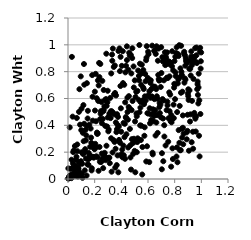
| Category | Series 0 |
|---|---|
| 0.8048160379679911 | 0.911 |
| 0.6412530690746505 | 0.43 |
| 0.036848699491668656 | 0.117 |
| 0.8508803725687043 | 0.799 |
| 0.6913978955041147 | 0.738 |
| 0.3902861109157759 | 0.27 |
| 0.5729293044220957 | 0.322 |
| 0.8110375856228726 | 0.939 |
| 0.24806886873163023 | 0.127 |
| 0.5027506385205199 | 0.429 |
| 0.44573678088368307 | 0.607 |
| 0.3434325248215889 | 0.835 |
| 0.561053336274124 | 0.586 |
| 0.24146370101987005 | 0.447 |
| 0.7851093031259042 | 0.449 |
| 0.20997103220456537 | 0.43 |
| 0.4303696479341876 | 0.795 |
| 0.10259249432398762 | 0.199 |
| 0.7798508613737885 | 0.84 |
| 0.24624403608130385 | 0.505 |
| 0.1730998822928173 | 0.308 |
| 0.8730987772841702 | 0.718 |
| 0.4771677226068377 | 0.513 |
| 0.19122029559249532 | 0.249 |
| 0.6785153978333146 | 0.972 |
| 0.03936746894879441 | 0.2 |
| 0.3206762801182168 | 0.505 |
| 0.38258311964538483 | 0.291 |
| 0.3844784113742594 | 0.281 |
| 0.3681660735472492 | 0.483 |
| 0.9689709140385898 | 0.669 |
| 0.6462743098852863 | 0.954 |
| 0.3099631757098164 | 0.159 |
| 0.8287489505397968 | 0.916 |
| 0.6857148374560557 | 0.536 |
| 0.4087598701721895 | 0.162 |
| 0.8693786946081973 | 0.936 |
| 0.8402111569531753 | 0.214 |
| 0.19983808856500268 | 0.223 |
| 0.806252504612378 | 0.794 |
| 0.29783745806520745 | 0.658 |
| 0.5157899796305667 | 0.467 |
| 0.8810528820988379 | 0.74 |
| 0.1490733598868999 | 0.508 |
| 0.4493409079521291 | 0.442 |
| 0.3490803277755809 | 0.276 |
| 0.8484357229467564 | 0.993 |
| 0.5293458375933919 | 0.591 |
| 0.4749559854918523 | 0.787 |
| 0.9367280181722548 | 0.352 |
| 0.6038354053874117 | 0.93 |
| 0.21098582234768798 | 0.238 |
| 0.12069687325942724 | 0.412 |
| 0.23005677510613035 | 0.698 |
| 0.020099144285102177 | 0.075 |
| 0.053496653326204194 | 0.084 |
| 0.14721049749832843 | 0.451 |
| 0.6044248210849298 | 0.487 |
| 0.9335570871204969 | 0.877 |
| 0.3604468680700396 | 0.623 |
| 0.643231094605576 | 0.489 |
| 0.9166533555953422 | 0.821 |
| 0.18891535484765548 | 0.24 |
| 0.37750553958991206 | 0.05 |
| 0.06481725295512407 | 0.038 |
| 0.49156706209330986 | 0.839 |
| 0.7650278276645177 | 0.87 |
| 0.7452519194500642 | 0.576 |
| 0.7916464292578508 | 0.554 |
| 0.4068009759231473 | 0.219 |
| 0.710834982930877 | 0.877 |
| 0.3133821718840352 | 0.118 |
| 0.7490497289972962 | 0.752 |
| 0.7035959168923077 | 0.072 |
| 0.3720860219728402 | 0.403 |
| 0.32833079129278914 | 0.505 |
| 0.6681677695936914 | 0.476 |
| 0.8272894318442069 | 0.741 |
| 0.04891064579619808 | 0.06 |
| 0.16629359704728555 | 0.24 |
| 0.023419354639812224 | 0.027 |
| 0.7985722187898523 | 0.879 |
| 0.16991982198271896 | 0.376 |
| 0.15444429967702467 | 0.195 |
| 0.18132061599412014 | 0.774 |
| 0.1702111666286856 | 0.163 |
| 0.9632057759010246 | 0.922 |
| 0.19315112764321993 | 0.159 |
| 0.31952743968310005 | 0.454 |
| 0.5693081703095949 | 0.571 |
| 0.004251761930587647 | 0.006 |
| 0.7430421501633343 | 0.943 |
| 0.697427239802067 | 0.46 |
| 0.9724679511926295 | 0.726 |
| 0.2173645918353844 | 0.346 |
| 0.9247368946319299 | 0.951 |
| 0.3632946576171775 | 0.349 |
| 0.5954264067940941 | 0.491 |
| 0.46419356395634676 | 0.373 |
| 0.6228622303132113 | 0.482 |
| 0.057300796040171006 | 0.049 |
| 0.4566102081277897 | 0.618 |
| 0.10893398358415206 | 0.009 |
| 0.6988001847450622 | 0.983 |
| 0.5646004305925687 | 0.812 |
| 0.33209803322518666 | 0.881 |
| 0.8081089625540443 | 0.767 |
| 0.596931256951981 | 0.619 |
| 0.3476574740772269 | 0.481 |
| 0.1397871017129596 | 0.026 |
| 0.45891351403084435 | 0.941 |
| 0.7169305897725119 | 0.585 |
| 0.9788435390067388 | 0.682 |
| 0.5787156323363809 | 0.783 |
| 0.7810713402161075 | 0.952 |
| 0.18611837737125309 | 0.435 |
| 0.05574871979741117 | 0.024 |
| 0.6547178969240556 | 0.513 |
| 0.17496583944255623 | 0.27 |
| 0.058492048325131656 | 0.097 |
| 0.2678159602451641 | 0.663 |
| 0.9384272792149398 | 0.225 |
| 0.1375155422211428 | 0.325 |
| 0.5160043820291768 | 0.2 |
| 0.695459926332687 | 0.686 |
| 0.8390021300136582 | 0.758 |
| 0.5818468911274911 | 0.729 |
| 0.9431416118818199 | 0.906 |
| 0.3654362141563176 | 0.104 |
| 0.35707544375562 | 0.226 |
| 0.7148270507419545 | 0.132 |
| 0.626209773768254 | 0.671 |
| 0.13431791821315836 | 0.153 |
| 0.9470443444692167 | 0.493 |
| 0.5500117425196831 | 0.397 |
| 0.9153122706672439 | 0.428 |
| 0.3588409693787901 | 0.421 |
| 0.5316174513720017 | 0.768 |
| 0.6642284447830702 | 0.989 |
| 0.7004161813679188 | 0.79 |
| 0.6769812162106348 | 0.776 |
| 0.3511859927170877 | 0.846 |
| 0.5750788586440214 | 0.385 |
| 0.8186558311569169 | 0.499 |
| 0.5678505033831696 | 0.671 |
| 0.2934922295686538 | 0.391 |
| 0.6314525070198469 | 0.994 |
| 0.28744572002241525 | 0.934 |
| 0.07585643305672715 | 0.08 |
| 0.32721904516621003 | 0.054 |
| 0.2792917243822691 | 0.395 |
| 0.1784138644780996 | 0.08 |
| 0.03143687584005224 | 0.034 |
| 0.576562385706362 | 0.616 |
| 0.37175541279924923 | 0.176 |
| 0.46128121574113173 | 0.526 |
| 0.8016925349532842 | 0.703 |
| 0.0025459312360142203 | 0.079 |
| 0.7255467778042767 | 0.874 |
| 0.8432535680032459 | 0.825 |
| 0.011003315112321476 | 0.019 |
| 0.7592884501775933 | 0.646 |
| 0.5193021105814963 | 0.275 |
| 0.7622489972222245 | 0.505 |
| 0.20782627532021755 | 0.784 |
| 0.07356854222332326 | 0.019 |
| 0.4187776700320601 | 0.177 |
| 0.9803273252812976 | 0.785 |
| 0.12572369945368816 | 0.064 |
| 0.9962262809924376 | 0.878 |
| 0.955091528708835 | 0.449 |
| 0.6069447748188267 | 0.621 |
| 0.5394631853148955 | 0.859 |
| 0.22332432873438213 | 0.339 |
| 0.8957698591122799 | 0.359 |
| 0.7891461199333766 | 0.81 |
| 0.0996434141433899 | 0.364 |
| 0.41515034023000635 | 0.249 |
| 0.5905139478385715 | 0.99 |
| 0.41675038389553093 | 0.418 |
| 0.773657236450272 | 0.092 |
| 0.44212130910114417 | 0.886 |
| 0.02567283399442044 | 0.006 |
| 0.7357055891118258 | 0.9 |
| 0.712584043953238 | 0.451 |
| 0.3528253194551974 | 0.641 |
| 0.12858840296570873 | 0.222 |
| 0.3243486007848635 | 0.787 |
| 0.7292748688178311 | 0.849 |
| 0.6128191903510176 | 0.527 |
| 0.2652916094593917 | 0.505 |
| 0.17699813911388584 | 0.064 |
| 0.18206875130349506 | 0.166 |
| 0.03367878854220705 | 0.085 |
| 0.20457784158936188 | 0.262 |
| 0.35437475748089486 | 0.085 |
| 0.30188381878609855 | 0.157 |
| 0.7832535737038714 | 0.229 |
| 0.8378237581727616 | 0.545 |
| 0.8878453451417957 | 0.872 |
| 0.7227709617211416 | 0.316 |
| 0.27119482135427997 | 0.181 |
| 0.6741525502740761 | 0.881 |
| 0.2846269977825291 | 0.596 |
| 0.04248283480025894 | 0.212 |
| 0.10569333759641586 | 0.114 |
| 0.3149154482639664 | 0.488 |
| 0.10613027869866468 | 0.04 |
| 0.6008738392626107 | 0.948 |
| 0.5583455519500062 | 0.238 |
| 0.019526181794592687 | 0.018 |
| 0.7319281915286389 | 0.25 |
| 0.3863287146455442 | 0.973 |
| 0.2502086209785679 | 0.574 |
| 0.5118125078379672 | 0.649 |
| 0.9359485178314961 | 0.865 |
| 0.02626952171052562 | 0.144 |
| 0.6189620236211834 | 0.605 |
| 0.32380969739468063 | 0.304 |
| 0.23548311139305195 | 0.76 |
| 0.08802271889430067 | 0.029 |
| 0.3303849235876428 | 0.927 |
| 0.5362201288249856 | 0.497 |
| 0.39445658199639444 | 0.91 |
| 0.8211185322290097 | 0.125 |
| 0.884926725820854 | 0.884 |
| 0.554770012315542 | 0.789 |
| 0.5047507612138872 | 0.05 |
| 0.8138530986290082 | 0.168 |
| 0.4936511180437289 | 0.682 |
| 0.5257141636804944 | 0.292 |
| 0.07729899798224192 | 0.09 |
| 0.22195285289826638 | 0.162 |
| 0.6611505145517063 | 0.67 |
| 0.48879040461983303 | 0.187 |
| 0.2574499699053005 | 0.731 |
| 0.15372361772268164 | 0.106 |
| 0.12216927066635556 | 0.703 |
| 0.9569947193062386 | 0.876 |
| 0.80283383021104 | 0.595 |
| 0.2272596090131578 | 0.581 |
| 0.7329941121807774 | 0.912 |
| 0.05169937658675466 | 0.246 |
| 0.2389293736291419 | 0.129 |
| 0.19409776975635853 | 0.165 |
| 0.1114741315942896 | 0.344 |
| 0.09720404005544354 | 0.132 |
| 0.40507617500263177 | 0.169 |
| 0.012877030387724989 | 0.385 |
| 0.006186548690355044 | 0.005 |
| 0.6480284451013497 | 0.595 |
| 0.49990928045378746 | 0.21 |
| 0.08582776277927397 | 0.669 |
| 0.3066266022679924 | 0.156 |
| 0.9495267015247435 | 0.47 |
| 0.6338795058866682 | 0.196 |
| 0.09564642717308515 | 0.765 |
| 0.845718230965016 | 0.215 |
| 0.8798297608187026 | 0.845 |
| 0.6104640549995154 | 0.654 |
| 0.9773982121956997 | 0.563 |
| 0.9023455612930342 | 0.669 |
| 0.2024244632717279 | 0.51 |
| 0.33630020221003804 | 0.972 |
| 0.09334830717075344 | 0.12 |
| 0.436367324262943 | 0.454 |
| 0.4037290532755966 | 0.844 |
| 0.5858075881716347 | 0.885 |
| 0.5639277297016065 | 0.683 |
| 0.7377081769587723 | 0.859 |
| 0.5701948762098781 | 0.558 |
| 0.2982828558493133 | 0.458 |
| 0.06602702955017496 | 0.455 |
| 0.7767001165413997 | 0.423 |
| 0.8540516027454408 | 0.775 |
| 0.2885757618384845 | 0.248 |
| 0.5536851859976736 | 0.852 |
| 0.8714939164513476 | 0.948 |
| 0.8169132408031525 | 0.235 |
| 0.9604627735899908 | 0.466 |
| 0.13353072803829116 | 0.288 |
| 0.16116040444494234 | 0.154 |
| 0.645677240170929 | 0.47 |
| 0.8923328184327886 | 0.866 |
| 0.2445044592955393 | 0.486 |
| 0.49742016741247386 | 0.278 |
| 0.5212950531172788 | 0.656 |
| 0.46291493973622916 | 0.921 |
| 0.22435324083276867 | 0.735 |
| 0.11328195037163839 | 0.186 |
| 0.04542772198222292 | 0.036 |
| 0.14172102281630997 | 0.714 |
| 0.8233251014317677 | 0.712 |
| 0.38136331223588515 | 0.392 |
| 0.5447603854827491 | 0.573 |
| 0.44630200163421735 | 0.499 |
| 0.6152622673486504 | 0.415 |
| 0.06954432759656205 | 0.257 |
| 0.9538337138075925 | 0.975 |
| 0.07823886163864259 | 0.075 |
| 0.29567267988940527 | 0.572 |
| 0.6209758316676542 | 0.736 |
| 0.4711321878775796 | 0.925 |
| 0.46733872729850434 | 0.251 |
| 0.04623738387279152 | 0.032 |
| 0.9185754063880479 | 0.482 |
| 0.9111752724431398 | 0.66 |
| 0.9930836196339418 | 0.484 |
| 0.90451054648089 | 0.589 |
| 0.8899003543592757 | 0.347 |
| 0.693345514646579 | 0.553 |
| 0.5431662295309747 | 0.532 |
| 0.3896380970998756 | 0.804 |
| 0.30515867955544 | 0.369 |
| 0.029177174765890736 | 0.91 |
| 0.03473832320113161 | 0.465 |
| 0.5886629924351962 | 0.904 |
| 0.835591764989214 | 0.27 |
| 0.9950032082174447 | 0.823 |
| 0.2588373860797932 | 0.153 |
| 0.060135003793550426 | 0.144 |
| 0.7463788877903434 | 0.549 |
| 0.592633580028227 | 0.244 |
| 0.3162496985230245 | 0.604 |
| 0.20126166044251567 | 0.651 |
| 0.6241956494478965 | 0.44 |
| 0.08679455388774969 | 0.05 |
| 0.9274336521782525 | 0.274 |
| 0.7091191694231516 | 0.596 |
| 0.6804002939747648 | 0.745 |
| 0.5352446029543049 | 0.998 |
| 0.982633620595707 | 0.322 |
| 0.0014173401793039727 | 0.003 |
| 0.41253459651920354 | 0.715 |
| 0.42771417932345396 | 0.15 |
| 0.3024526287686202 | 0.355 |
| 0.5869260479446795 | 0.131 |
| 0.9847453372522129 | 0.587 |
| 0.9502558711059987 | 0.911 |
| 0.48625964030769175 | 0.267 |
| 0.40118843626863987 | 0.185 |
| 0.26075685522955766 | 0.448 |
| 0.19626981598331356 | 0.226 |
| 0.8961353264265077 | 0.479 |
| 0.008951014118490511 | 0.018 |
| 0.8670603424126889 | 0.338 |
| 0.9716295100431026 | 0.706 |
| 0.4686047192664362 | 0.16 |
| 0.7047381538014715 | 0.192 |
| 0.12635470994151074 | 0.2 |
| 0.31008074148234 | 0.487 |
| 0.374935448754331 | 0.463 |
| 0.3447304075864913 | 0.631 |
| 0.27539367529782316 | 0.195 |
| 0.9126504838109599 | 0.882 |
| 0.7666258164017056 | 0.629 |
| 0.28295579248363056 | 0.161 |
| 0.508342251192858 | 0.287 |
| 0.39321054214407003 | 0.693 |
| 0.26812384855005045 | 0.518 |
| 0.48136507836854203 | 0.901 |
| 0.8472000293063932 | 0.643 |
| 0.6095097475139214 | 0.126 |
| 0.1566214265517475 | 0.154 |
| 0.7397729982779764 | 0.513 |
| 0.8538222985448833 | 0.375 |
| 0.28131536653435685 | 0.141 |
| 0.5410113143359803 | 0.4 |
| 0.16263601469403038 | 0.175 |
| 0.6719616360124111 | 0.598 |
| 0.5008025319284766 | 0.735 |
| 0.9450038752325354 | 0.877 |
| 0.7218275351179362 | 0.401 |
| 0.36753989602754356 | 0.372 |
| 0.9644264661205062 | 0.98 |
| 0.24244693615111684 | 0.857 |
| 0.4552812150957252 | 0.537 |
| 0.7934859104057508 | 0.454 |
| 0.861456895910077 | 0.474 |
| 0.23647019126137492 | 0.239 |
| 0.7708872536418231 | 0.864 |
| 0.4523679563511088 | 0.814 |
| 0.435180899166777 | 0.844 |
| 0.8562217136463667 | 0.309 |
| 0.1841013702159052 | 0.613 |
| 0.4219888138147045 | 0.702 |
| 0.9236828227154171 | 0.912 |
| 0.11961414322667153 | 0.857 |
| 0.7569432886640876 | 0.876 |
| 0.9912602430137946 | 0.977 |
| 0.8759689700202944 | 0.75 |
| 0.23329685106903708 | 0.865 |
| 0.3784666447933918 | 0.954 |
| 0.76153144905519 | 0.765 |
| 0.6887186105020155 | 0.492 |
| 0.7956687180878755 | 0.681 |
| 0.719378736267653 | 0.736 |
| 0.041499562839395265 | 0.036 |
| 0.09057465893928303 | 0.405 |
| 0.7746516469322732 | 0.476 |
| 0.7553424669311714 | 0.858 |
| 0.9665617627023164 | 0.864 |
| 0.3987209460061791 | 0.352 |
| 0.9742837852943418 | 0.627 |
| 0.4844253448565549 | 0.581 |
| 0.7269521220533531 | 0.945 |
| 0.9069609003898131 | 0.211 |
| 0.6872224141608977 | 0.566 |
| 0.5829618563947645 | 0.585 |
| 0.4335052004827897 | 0.462 |
| 0.13169487578507857 | 0.367 |
| 0.6566089395323323 | 0.324 |
| 0.2639255128353661 | 0.081 |
| 0.2765287404126788 | 0.588 |
| 0.6390117044772514 | 0.69 |
| 0.9301674912684056 | 0.582 |
| 0.5992929948883348 | 0.753 |
| 0.8153905685128157 | 0.982 |
| 0.9205150469132967 | 0.771 |
| 0.4259065800518511 | 0.411 |
| 0.8583198121879995 | 0.651 |
| 0.016319693774990665 | 0.028 |
| 0.513187397122194 | 0.489 |
| 0.6663663677588026 | 0.617 |
| 0.11756236196857932 | 0.282 |
| 0.4729816625497727 | 0.07 |
| 0.06354872401932923 | 0.165 |
| 0.7516971592958311 | 0.278 |
| 0.7074827867167729 | 0.908 |
| 0.8300571113545581 | 0.364 |
| 0.4414608648082849 | 0.989 |
| 0.3342864665711034 | 0.198 |
| 0.9583146697958732 | 0.354 |
| 0.3386570557855668 | 0.493 |
| 0.9411610354700035 | 0.746 |
| 0.5262022897289605 | 0.808 |
| 0.7867224411858997 | 0.149 |
| 0.4288211925171365 | 0.571 |
| 0.4382168163578531 | 0.334 |
| 0.5229539007081078 | 0.303 |
| 0.833956175453485 | 0.997 |
| 0.6356167118776629 | 0.184 |
| 0.9019803704293399 | 0.618 |
| 0.49475358526100255 | 0.3 |
| 0.14583691243497582 | 0.109 |
| 0.8620066643203624 | 0.382 |
| 0.7974026840709623 | 0.709 |
| 0.7699843633873352 | 0.43 |
| 0.3411244877127755 | 0.29 |
| 0.08046556629204787 | 0.126 |
| 0.15036181048545097 | 0.147 |
| 0.5062537922012279 | 0.611 |
| 0.014703220502637145 | 0.009 |
| 0.6725819227668881 | 0.344 |
| 0.989411404189051 | 0.95 |
| 0.21224475868005416 | 0.169 |
| 0.8993334392982846 | 0.637 |
| 0.39648743595194247 | 0.527 |
| 0.4236894743046 | 0.312 |
| 0.7534884722674006 | 0.452 |
| 0.533160720813824 | 0.736 |
| 0.1011751668344194 | 0.524 |
| 0.27282527164016507 | 0.542 |
| 0.2900080108782295 | 0.545 |
| 0.48282163197100664 | 0.975 |
| 0.08239851724877918 | 0.5 |
| 0.9985994271823669 | 0.943 |
| 0.629030960506534 | 0.616 |
| 0.6521424917634908 | 0.688 |
| 0.2543821224929723 | 0.416 |
| 0.2184824302737793 | 0.336 |
| 0.9094795172371621 | 0.822 |
| 0.41083057306726245 | 0.953 |
| 0.9284357248829761 | 0.848 |
| 0.6626427791664942 | 0.421 |
| 0.6581896940297888 | 0.932 |
| 0.25399014575965473 | 0.19 |
| 0.5490534452314146 | 0.701 |
| 0.47865498994771744 | 0.297 |
| 0.7411382445262601 | 0.755 |
| 0.0705422653985541 | 0.208 |
| 0.14342377212769908 | 0.395 |
| 0.1644417291298606 | 0.175 |
| 0.11558285317234294 | 0.551 |
| 0.6179660438168715 | 0.716 |
| 0.5466750071893155 | 0.29 |
| 0.8832712474533523 | 0.903 |
| 0.6503352628211341 | 0.959 |
| 0.6378421120396448 | 0.519 |
| 0.556653714259773 | 0.033 |
| 0.864092065002325 | 0.259 |
| 0.4513612883704159 | 0.235 |
| 0.8765018873034283 | 0.924 |
| 0.21545099588051694 | 0.602 |
| 0.22934550306465137 | 0.061 |
| 0.9868953963175638 | 0.168 |
| 0.6834623554245248 | 0.733 |
| 0.8904267720241162 | 0.296 |
| 0.8255797019972418 | 0.931 |
| 0.1595955461793569 | 0.405 |